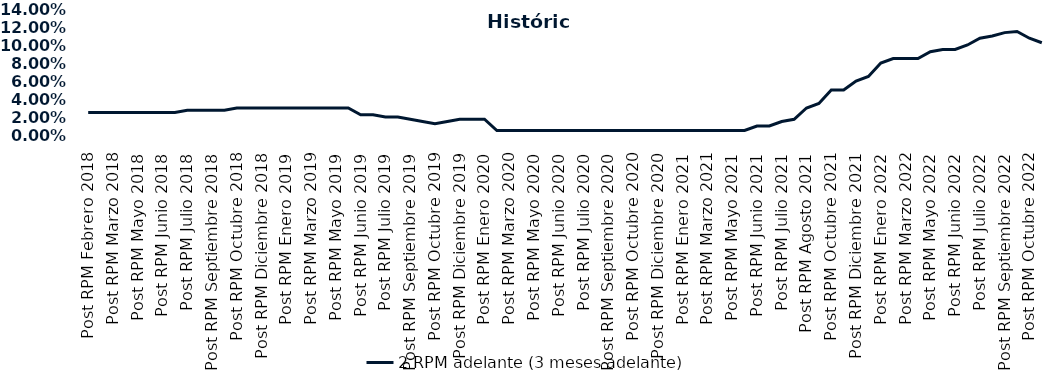
| Category | 2 RPM adelante (3 meses adelante) |
|---|---|
| Post RPM Febrero 2018 | 0.025 |
| Pre RPM Marzo 2018 | 0.025 |
| Post RPM Marzo 2018 | 0.025 |
| Pre RPM Mayo 2018 | 0.025 |
| Post RPM Mayo 2018 | 0.025 |
| Pre RPM Junio 2018 | 0.025 |
| Post RPM Junio 2018 | 0.025 |
| Pre RPM Julio 2018 | 0.025 |
| Post RPM Julio 2018 | 0.028 |
| Pre RPM Septiembre 2018 | 0.028 |
| Post RPM Septiembre 2018 | 0.028 |
| Pre RPM Octubre 2018 | 0.028 |
| Post RPM Octubre 2018 | 0.03 |
| Pre RPM Diciembre 2018 | 0.03 |
| Post RPM Diciembre 2018 | 0.03 |
| Pre RPM Enero 2019 | 0.03 |
| Post RPM Enero 2019 | 0.03 |
| Pre RPM Marzo 2019 | 0.03 |
| Post RPM Marzo 2019 | 0.03 |
| Pre RPM Mayo 2019 | 0.03 |
| Post RPM Mayo 2019 | 0.03 |
| Pre RPM Junio 2019 | 0.03 |
| Post RPM Junio 2019 | 0.022 |
| Pre RPM Julio 2019 | 0.022 |
| Post RPM Julio 2019 | 0.02 |
| Pre RPM Septiembre 2019 | 0.02 |
| Post RPM Septiembre 2019 | 0.018 |
| Pre RPM Octubre 2019 | 0.015 |
| Post RPM Octubre 2019 | 0.012 |
| Pre RPM Diciembre 2019 | 0.015 |
| Post RPM Diciembre 2019 | 0.018 |
| Pre RPM Enero 2020 | 0.018 |
| Post RPM Enero 2020 | 0.018 |
| Pre RPM Marzo 2020 | 0.005 |
| Post RPM Marzo 2020 | 0.005 |
| Pre RPM Mayo 2020 | 0.005 |
| Post RPM Mayo 2020 | 0.005 |
| Pre RPM Junio 2020 | 0.005 |
| Post RPM Junio 2020 | 0.005 |
| Pre RPM Julio 2020 | 0.005 |
| Post RPM Julio 2020 | 0.005 |
| Pre RPM Septiembre 2020 | 0.005 |
| Post RPM Septiembre 2020 | 0.005 |
| Pre RPM Octubre 2020 | 0.005 |
| Post RPM Octubre 2020 | 0.005 |
| Pre RPM Diciembre 2020 | 0.005 |
| Post RPM Diciembre 2020 | 0.005 |
| Pre RPM Enero 2021 | 0.005 |
| Post RPM Enero 2021 | 0.005 |
| Pre RPM Marzo 2021 | 0.005 |
| Post RPM Marzo 2021 | 0.005 |
| Pre RPM Mayo 2021 | 0.005 |
| Post RPM Mayo 2021 | 0.005 |
| Pre RPM Junio 2021 | 0.005 |
| Post RPM Junio 2021 | 0.01 |
| Pre RPM Julio 2021 | 0.01 |
| Post RPM Julio 2021 | 0.015 |
| Pre RPM Agosto 2021 | 0.018 |
| Post RPM Agosto 2021 | 0.03 |
| Pre RPM Octubre 2021 | 0.035 |
| Post RPM Octubre 2021 | 0.05 |
| Pre RPM Diciembre 2021 | 0.05 |
| Post RPM Diciembre 2021 | 0.06 |
| Pre RPM Enero 2022 | 0.065 |
| Post RPM Enero 2022 | 0.08 |
| Pre RPM Marzo 2022 | 0.085 |
| Post RPM Marzo 2022 | 0.085 |
| Pre RPM Mayo 2022 | 0.085 |
| Post RPM Mayo 2022 | 0.092 |
| Pre RPM Junio 2022 | 0.095 |
| Post RPM Junio 2022 | 0.095 |
| Pre RPM Julio 2022 | 0.1 |
| Post RPM Julio 2022 | 0.108 |
| Pre RPM Septiembre 2022 | 0.11 |
| Post RPM Septiembre 2022 | 0.114 |
| Pre RPM Octubre 2022 | 0.115 |
| Post RPM Octubre 2022 | 0.108 |
| Pre RPM Diciembre 2022 | 0.102 |